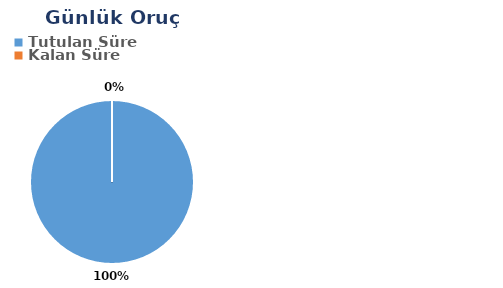
| Category | Günlük |
|---|---|
| Tutulan Süre | 0.586 |
| Kalan Süre | 0 |